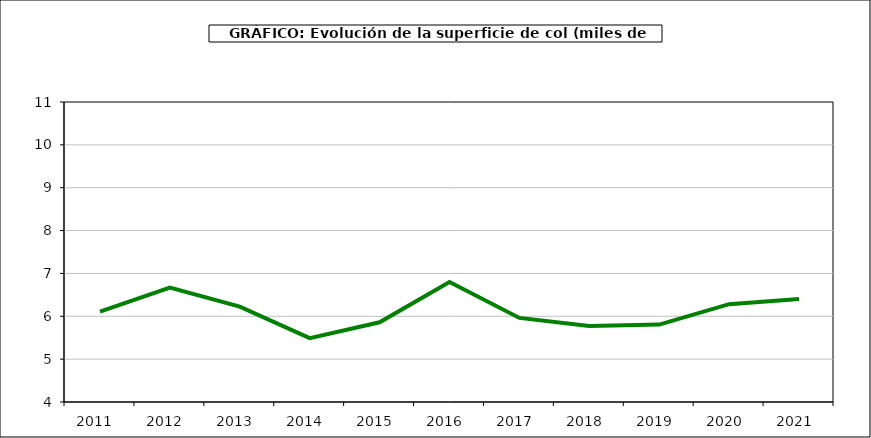
| Category | superficie |
|---|---|
| 2011.0 | 6.108 |
| 2012.0 | 6.669 |
| 2013.0 | 6.224 |
| 2014.0 | 5.489 |
| 2015.0 | 5.861 |
| 2016.0 | 6.799 |
| 2017.0 | 5.962 |
| 2018.0 | 5.774 |
| 2019.0 | 5.806 |
| 2020.0 | 6.282 |
| 2021.0 | 6.401 |